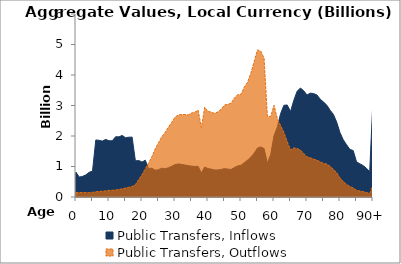
| Category | Public Transfers, Inflows | Public Transfers, Outflows |
|---|---|---|
| 0 | 807.515 | 146.377 |
|  | 653.199 | 143.781 |
| 2 | 676.649 | 151.076 |
| 3 | 725.18 | 145.022 |
| 4 | 810.622 | 141.866 |
| 5 | 848.085 | 153.61 |
| 6 | 1869.937 | 171.084 |
| 7 | 1858.431 | 180.192 |
| 8 | 1833.355 | 188.425 |
| 9 | 1889.344 | 201.88 |
| 10 | 1844.033 | 214.503 |
| 11 | 1842.01 | 219.783 |
| 12 | 1975.653 | 231.547 |
| 13 | 1971.02 | 247.353 |
| 14 | 2019.04 | 268.832 |
| 15 | 1943.229 | 293.749 |
| 16 | 1960.475 | 317.183 |
| 17 | 1963.286 | 344.539 |
| 18 | 1181.692 | 405.322 |
| 19 | 1198.56 | 568.613 |
| 20 | 1144.727 | 731.895 |
| 21 | 1206.785 | 924.623 |
| 22 | 929.106 | 1112.16 |
| 23 | 945.52 | 1321.774 |
| 24 | 877.544 | 1578.003 |
| 25 | 896.431 | 1776.754 |
| 26 | 945.07 | 1975.013 |
| 27 | 926.372 | 2117.711 |
| 28 | 959.949 | 2289.381 |
| 29 | 1006.187 | 2449.991 |
| 30 | 1061.694 | 2615.482 |
| 31 | 1085.048 | 2691.376 |
| 32 | 1069.924 | 2702.881 |
| 33 | 1049.296 | 2704.195 |
| 34 | 1027.716 | 2691.811 |
| 35 | 1013.196 | 2751.811 |
| 36 | 1001.332 | 2782.538 |
| 37 | 1006.584 | 2846.68 |
| 38 | 787.603 | 2276.956 |
| 39 | 984.04 | 2942.338 |
| 40 | 932.071 | 2804.719 |
| 41 | 914.146 | 2783.03 |
| 42 | 888.646 | 2740.045 |
| 43 | 885.212 | 2790.414 |
| 44 | 904.258 | 2876.307 |
| 45 | 930.512 | 3015.709 |
| 46 | 915.939 | 3040.575 |
| 47 | 902.848 | 3070.455 |
| 48 | 967.727 | 3248.292 |
| 49 | 1018.964 | 3356.988 |
| 50 | 1039.328 | 3367.628 |
| 51 | 1126.569 | 3600.629 |
| 52 | 1210.453 | 3765.237 |
| 53 | 1309.623 | 4067.538 |
| 54 | 1437.853 | 4441.089 |
| 55 | 1607.098 | 4824.965 |
| 56 | 1641.193 | 4778.808 |
| 57 | 1588.374 | 4547.125 |
| 58 | 1106.439 | 2641.066 |
| 59 | 1394.548 | 2640.567 |
| 60 | 2012.809 | 3008.463 |
| 61 | 2292.687 | 2572.205 |
| 62 | 2734.222 | 2342.782 |
| 63 | 3006.195 | 2119.373 |
| 64 | 3017.254 | 1816.408 |
| 65 | 2802.593 | 1546.298 |
| 66 | 3169.405 | 1609.198 |
| 67 | 3464.236 | 1590.67 |
| 68 | 3572.906 | 1539.703 |
| 69 | 3484.005 | 1427.146 |
| 70 | 3343.799 | 1318.436 |
| 71 | 3405.74 | 1285.597 |
| 72 | 3389.715 | 1243.013 |
| 73 | 3347.383 | 1207.457 |
| 74 | 3208.492 | 1153.542 |
| 75 | 3114.517 | 1102.647 |
| 76 | 3011.67 | 1078.17 |
| 77 | 2844.998 | 1007.586 |
| 78 | 2708.879 | 906.745 |
| 79 | 2454.168 | 797.125 |
| 80 | 2110.177 | 624.647 |
| 81 | 1873.547 | 506.907 |
| 82 | 1713.036 | 409.664 |
| 83 | 1561.968 | 344.18 |
| 84 | 1522.472 | 296.98 |
| 85 | 1155.524 | 222.085 |
| 86 | 1090.58 | 196.035 |
| 87 | 1031.294 | 177.54 |
| 88 | 943.692 | 145.373 |
| 89 | 826.971 | 114.843 |
| 90+ | 3210.427 | 399.187 |